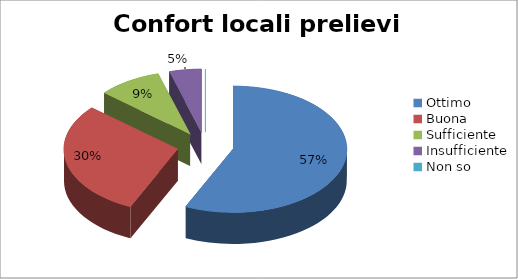
| Category | Confort locali prelievi |
|---|---|
| Ottimo | 25 |
| Buona | 13 |
| Sufficiente | 4 |
| Insufficiente | 2 |
| Non so | 0 |